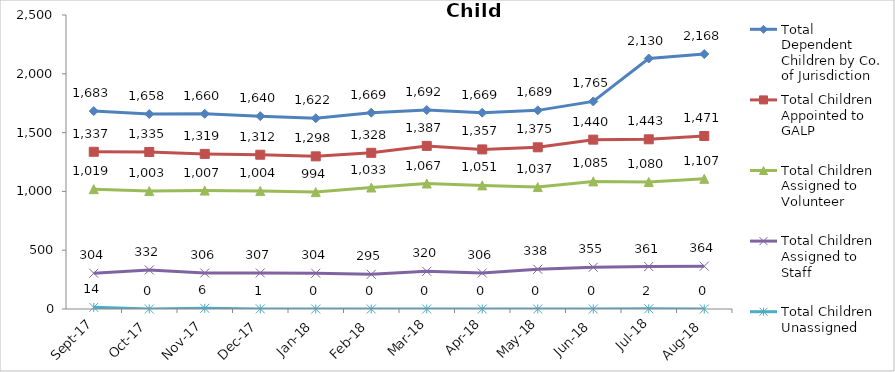
| Category | Total Dependent Children by Co. of Jurisdiction | Total Children Appointed to GALP | Total Children Assigned to Volunteer | Total Children Assigned to Staff | Total Children Unassigned |
|---|---|---|---|---|---|
| 2017-09-01 | 1683 | 1337 | 1019 | 304 | 14 |
| 2017-10-01 | 1658 | 1335 | 1003 | 332 | 0 |
| 2017-11-01 | 1660 | 1319 | 1007 | 306 | 6 |
| 2017-12-01 | 1640 | 1312 | 1004 | 307 | 1 |
| 2018-01-01 | 1622 | 1298 | 994 | 304 | 0 |
| 2018-02-01 | 1669 | 1328 | 1033 | 295 | 0 |
| 2018-03-01 | 1692 | 1387 | 1067 | 320 | 0 |
| 2018-04-01 | 1669 | 1357 | 1051 | 306 | 0 |
| 2018-05-01 | 1689 | 1375 | 1037 | 338 | 0 |
| 2018-06-01 | 1765 | 1440 | 1085 | 355 | 0 |
| 2018-07-01 | 2130 | 1443 | 1080 | 361 | 2 |
| 2018-08-01 | 2168 | 1471 | 1107 | 364 | 0 |